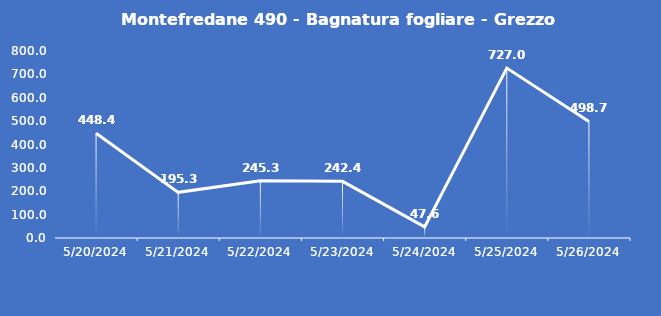
| Category | Montefredane 490 - Bagnatura fogliare - Grezzo (min) |
|---|---|
| 5/20/24 | 448.4 |
| 5/21/24 | 195.3 |
| 5/22/24 | 245.3 |
| 5/23/24 | 242.4 |
| 5/24/24 | 47.6 |
| 5/25/24 | 727 |
| 5/26/24 | 498.7 |